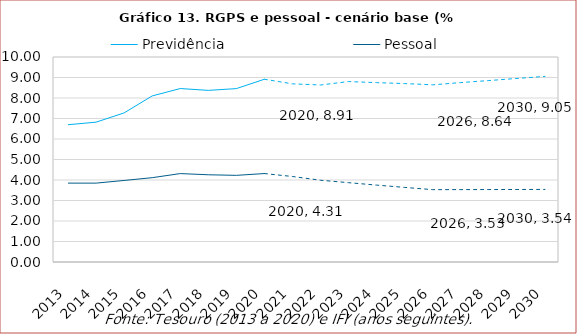
| Category | Previdência | Pessoal |
|---|---|---|
| 2013.0 | 6.696 | 3.848 |
| 2014.0 | 6.821 | 3.848 |
| 2015.0 | 7.273 | 3.978 |
| 2016.0 | 8.101 | 4.113 |
| 2017.0 | 8.462 | 4.313 |
| 2018.0 | 8.372 | 4.255 |
| 2019.0 | 8.458 | 4.227 |
| 2020.0 | 8.914 | 4.315 |
| 2021.0 | 8.691 | 4.171 |
| 2022.0 | 8.634 | 3.989 |
| 2023.0 | 8.802 | 3.87 |
| 2024.0 | 8.75 | 3.751 |
| 2025.0 | 8.703 | 3.638 |
| 2026.0 | 8.642 | 3.529 |
| 2027.0 | 8.752 | 3.532 |
| 2028.0 | 8.851 | 3.535 |
| 2029.0 | 8.955 | 3.537 |
| 2030.0 | 9.054 | 3.54 |